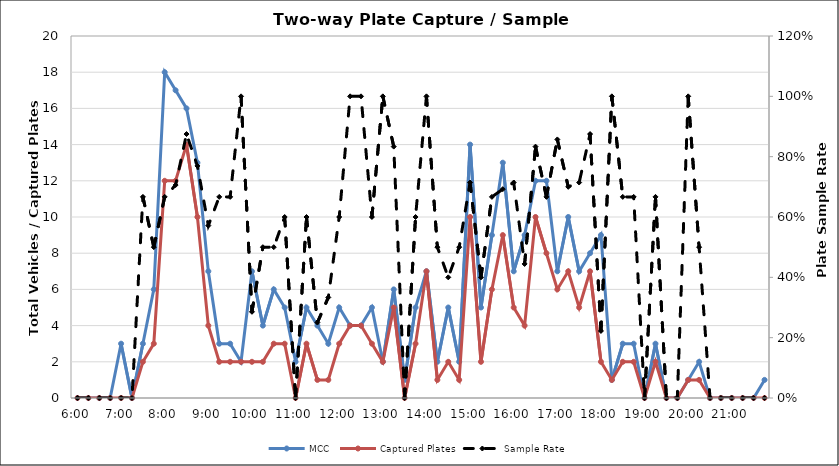
| Category | MCC | Captured Plates |
|---|---|---|
| 0.25 | 0 | 0 |
| 0.260416666666667 | 0 | 0 |
| 0.270833333333333 | 0 | 0 |
| 0.28125 | 0 | 0 |
| 0.291666666666667 | 3 | 0 |
| 0.302083333333333 | 0 | 0 |
| 0.3125 | 3 | 2 |
| 0.322916666666667 | 6 | 3 |
| 0.333333333333333 | 18 | 12 |
| 0.34375 | 17 | 12 |
| 0.354166666666667 | 16 | 14 |
| 0.364583333333333 | 13 | 10 |
| 0.375 | 7 | 4 |
| 0.385416666666667 | 3 | 2 |
| 0.395833333333333 | 3 | 2 |
| 0.40625 | 2 | 2 |
| 0.416666666666667 | 7 | 2 |
| 0.427083333333333 | 4 | 2 |
| 0.4375 | 6 | 3 |
| 0.447916666666667 | 5 | 3 |
| 0.458333333333333 | 2 | 0 |
| 0.46875 | 5 | 3 |
| 0.479166666666667 | 4 | 1 |
| 0.489583333333333 | 3 | 1 |
| 0.5 | 5 | 3 |
| 0.510416666666667 | 4 | 4 |
| 0.520833333333333 | 4 | 4 |
| 0.53125 | 5 | 3 |
| 0.541666666666667 | 2 | 2 |
| 0.552083333333333 | 6 | 5 |
| 0.5625 | 1 | 0 |
| 0.572916666666667 | 5 | 3 |
| 0.583333333333333 | 7 | 7 |
| 0.59375 | 2 | 1 |
| 0.604166666666667 | 5 | 2 |
| 0.614583333333333 | 2 | 1 |
| 0.625 | 14 | 10 |
| 0.635416666666667 | 5 | 2 |
| 0.645833333333333 | 9 | 6 |
| 0.65625 | 13 | 9 |
| 0.666666666666667 | 7 | 5 |
| 0.677083333333333 | 9 | 4 |
| 0.6875 | 12 | 10 |
| 0.697916666666667 | 12 | 8 |
| 0.708333333333333 | 7 | 6 |
| 0.71875 | 10 | 7 |
| 0.729166666666667 | 7 | 5 |
| 0.739583333333333 | 8 | 7 |
| 0.75 | 9 | 2 |
| 0.760416666666667 | 1 | 1 |
| 0.770833333333333 | 3 | 2 |
| 0.78125 | 3 | 2 |
| 0.791666666666667 | 0 | 0 |
| 0.802083333333333 | 3 | 2 |
| 0.8125 | 0 | 0 |
| 0.822916666666667 | 0 | 0 |
| 0.833333333333333 | 1 | 1 |
| 0.84375 | 2 | 1 |
| 0.854166666666667 | 0 | 0 |
| 0.864583333333333 | 0 | 0 |
| 0.875 | 0 | 0 |
| 0.885416666666667 | 0 | 0 |
| 0.895833333333333 | 0 | 0 |
| 0.90625 | 1 | 0 |